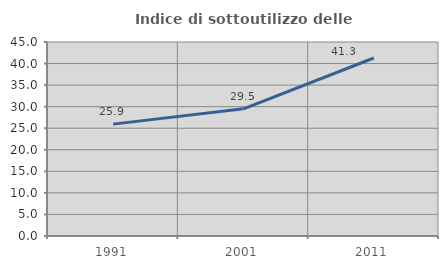
| Category | Indice di sottoutilizzo delle abitazioni  |
|---|---|
| 1991.0 | 25.949 |
| 2001.0 | 29.502 |
| 2011.0 | 41.286 |